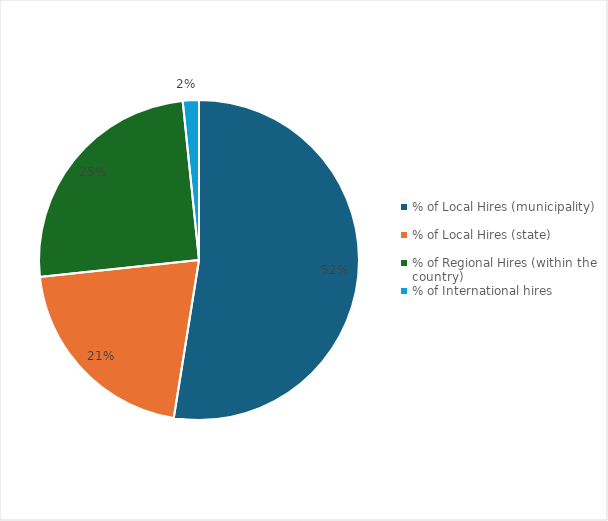
| Category | Series 0 |
|---|---|
| % of Local Hires (municipality)  | 0.525 |
| % of Local Hires (state)  | 0.208 |
| % of Regional Hires (within the country)  | 0.251 |
| % of International hires | 0.016 |